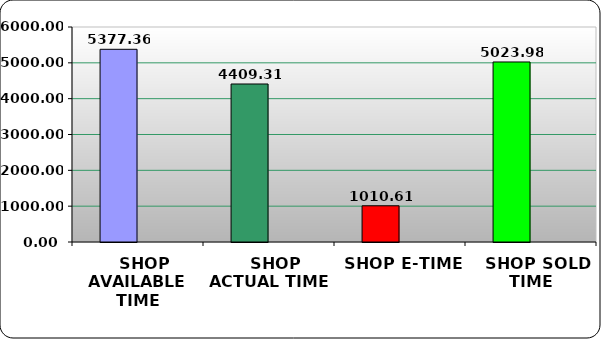
| Category | Series 0 | Series 1 |
|---|---|---|
|   SHOP AVAILABLE TIME | 5377.36 |  |
|   SHOP ACTUAL TIME | 4409.31 |  |
|   SHOP E-TIME | 1010.61 |  |
|   SHOP SOLD TIME | 5023.98 |  |